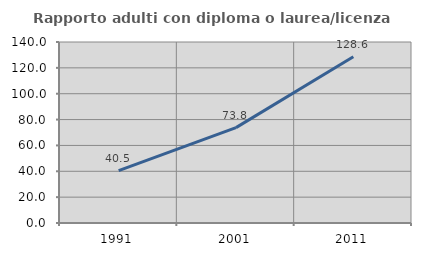
| Category | Rapporto adulti con diploma o laurea/licenza media  |
|---|---|
| 1991.0 | 40.489 |
| 2001.0 | 73.789 |
| 2011.0 | 128.591 |